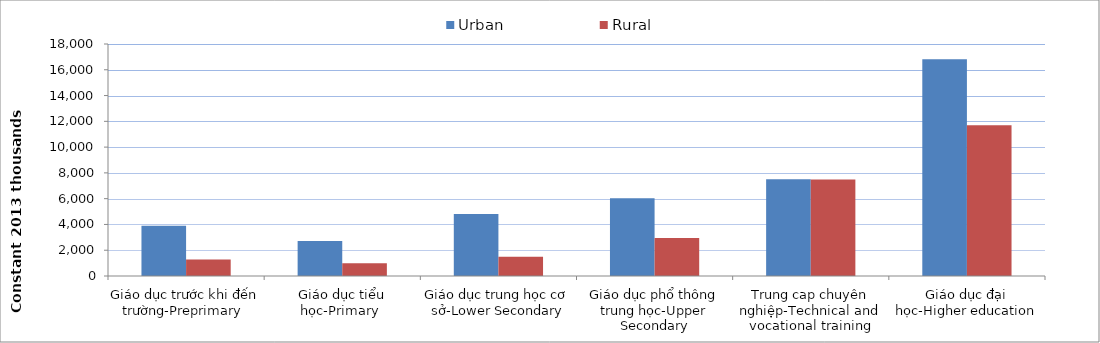
| Category | Urban | Rural |
|---|---|---|
| Giáo dục trước khi đến trường-Preprimary  | 3901.908 | 1277.39 |
| Giáo dục tiểu học-Primary  | 2709.406 | 995.923 |
| Giáo dục trung học cơ sở-Lower Secondary | 4801.056 | 1484.061 |
| Giáo dục phổ thông trung học-Upper Secondary | 6026.2 | 2950.683 |
| Trung cap chuyên nghiệp-Technical and vocational training | 7500.428 | 7495.091 |
| Giáo dục đại học-Higher education | 16818.58 | 11692.57 |